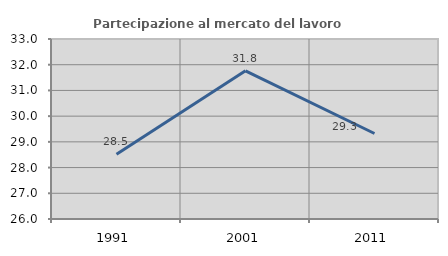
| Category | Partecipazione al mercato del lavoro  femminile |
|---|---|
| 1991.0 | 28.521 |
| 2001.0 | 31.763 |
| 2011.0 | 29.324 |